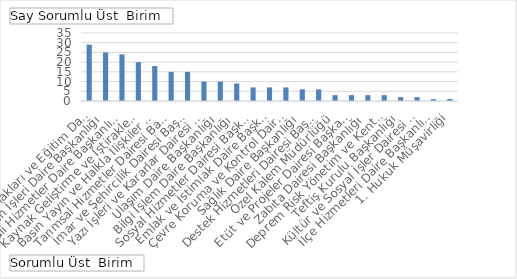
| Category | Toplam |
|---|---|
| İnsan Kaynakları ve Eğitim Dairesi Başkanlığı | 29 |
| Fen İşleri Daire Başkanlığı | 25 |
| Mali Hizmetler Daire Başkanlığı | 24 |
| Kaynak Geliştirme ve İştirakler Daire Başkanlığı | 20 |
| Basın Yayın ve Halkla İlişkiler Dairesi Başkanlığı | 18 |
| Tarımsal Hizmetler Dairesi Başkanlığı | 15 |
| İmar ve Şehircilik Dairesi Başkanlığı | 15 |
| Yazı İşleri ve Kararlar Dairesi Başkanlığı | 10 |
| Ulaşım Daire Başkanlığı | 10 |
| Bilgi İşlem Daire Başkanlığı | 9 |
| Sosyal Hizmetler Dairesi Başkanlığı | 7 |
| Emlak ve İstimlak Daire Başkanlığı | 7 |
| Çevre Koruma ve Kontrol Daire Başkanlığı | 7 |
| Sağlık Daire Başkanlığı | 6 |
| Destek Hizmetleri Dairesi Başkanlığı | 6 |
| Özel Kalem Müdürlüğü | 3 |
| Etüt ve Projeler Dairesi Başkanlığı | 3 |
| Zabıta Dairesi Başkanlığı | 3 |
| Deprem Risk Yönetim ve Kentsel İyileştirme Dairesi Başkanlığı | 3 |
| Teftiş Kurulu Başkanlığı | 2 |
| Kültür ve Sosyal İşler Dairesi Başkanlığı | 2 |
| İlçe Hizmetleri Daire Başkanlığı | 1 |
| 1. Hukuk Müşavirliği | 1 |